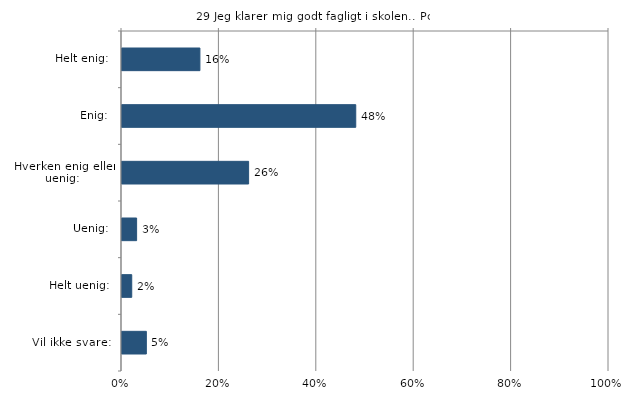
| Category | Jeg klarer mig godt fagligt i skolen. |
|---|---|
| Helt enig:  | 0.16 |
| Enig:  | 0.48 |
| Hverken enig eller uenig:  | 0.26 |
| Uenig:  | 0.03 |
| Helt uenig:  | 0.02 |
| Vil ikke svare:  | 0.05 |